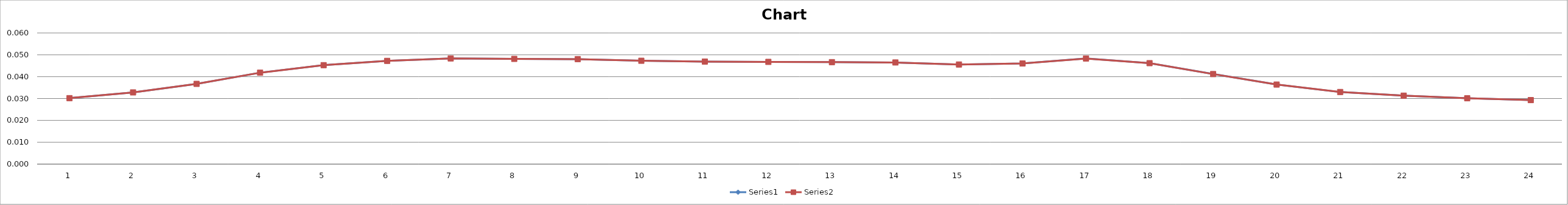
| Category | Series 0 | Series 1 |
|---|---|---|
| 0 | 0.03 | 0.03 |
| 1 | 0.033 | 0.033 |
| 2 | 0.037 | 0.037 |
| 3 | 0.042 | 0.042 |
| 4 | 0.045 | 0.045 |
| 5 | 0.047 | 0.047 |
| 6 | 0.048 | 0.048 |
| 7 | 0.048 | 0.048 |
| 8 | 0.048 | 0.048 |
| 9 | 0.047 | 0.047 |
| 10 | 0.047 | 0.047 |
| 11 | 0.047 | 0.047 |
| 12 | 0.047 | 0.047 |
| 13 | 0.046 | 0.046 |
| 14 | 0.046 | 0.046 |
| 15 | 0.046 | 0.046 |
| 16 | 0.048 | 0.048 |
| 17 | 0.046 | 0.046 |
| 18 | 0.041 | 0.041 |
| 19 | 0.036 | 0.036 |
| 20 | 0.033 | 0.033 |
| 21 | 0.031 | 0.031 |
| 22 | 0.03 | 0.03 |
| 23 | 0.029 | 0.029 |